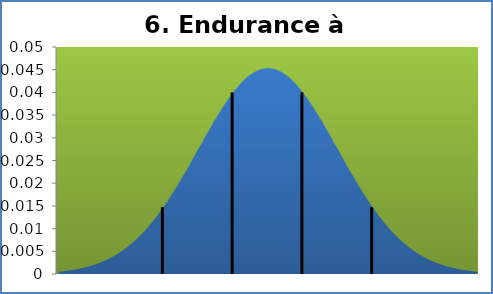
| Category | densité |
|---|---|
| 19.770000000000003 | 0.001 |
| 20.21 | 0.001 |
| 20.65 | 0.001 |
| 21.09 | 0.001 |
| 21.529999999999998 | 0.001 |
| 21.97 | 0.001 |
| 22.41 | 0.001 |
| 22.85 | 0.001 |
| 23.29 | 0.002 |
| 23.73 | 0.002 |
| 24.169999999999998 | 0.002 |
| 24.61 | 0.002 |
| 25.05 | 0.003 |
| 25.490000000000002 | 0.003 |
| 25.93 | 0.003 |
| 26.369999999999997 | 0.004 |
| 26.81 | 0.004 |
| 27.25 | 0.004 |
| 27.69 | 0.005 |
| 28.130000000000003 | 0.006 |
| 28.57 | 0.006 |
| 29.009999999999998 | 0.007 |
| 29.45 | 0.007 |
| 29.89 | 0.008 |
| 30.330000000000002 | 0.009 |
| 30.770000000000003 | 0.01 |
| 31.21 | 0.011 |
| 31.65 | 0.012 |
| 32.09 | 0.013 |
| 32.53 | 0.014 |
| 32.97 | 0.015 |
| 33.41 | 0.016 |
| 33.85 | 0.017 |
| 34.29 | 0.018 |
| 34.730000000000004 | 0.019 |
| 35.17 | 0.021 |
| 35.61 | 0.022 |
| 36.05 | 0.023 |
| 36.49 | 0.025 |
| 36.93 | 0.026 |
| 37.370000000000005 | 0.027 |
| 37.81 | 0.029 |
| 38.25 | 0.03 |
| 38.69 | 0.032 |
| 39.13 | 0.033 |
| 39.57 | 0.034 |
| 40.01 | 0.035 |
| 40.45 | 0.037 |
| 40.89 | 0.038 |
| 41.33 | 0.039 |
| 41.77 | 0.04 |
| 42.21 | 0.041 |
| 42.65 | 0.042 |
| 43.09 | 0.043 |
| 43.53 | 0.043 |
| 43.97 | 0.044 |
| 44.410000000000004 | 0.044 |
| 44.85 | 0.045 |
| 45.29 | 0.045 |
| 45.730000000000004 | 0.045 |
| 46.17 | 0.045 |
| 46.61 | 0.045 |
| 47.050000000000004 | 0.045 |
| 47.49 | 0.045 |
| 47.93 | 0.044 |
| 48.370000000000005 | 0.044 |
| 48.81 | 0.043 |
| 49.25 | 0.043 |
| 49.690000000000005 | 0.042 |
| 50.13 | 0.041 |
| 50.57 | 0.04 |
| 51.010000000000005 | 0.039 |
| 51.45 | 0.038 |
| 51.89 | 0.037 |
| 52.330000000000005 | 0.035 |
| 52.77 | 0.034 |
| 53.21 | 0.033 |
| 53.650000000000006 | 0.032 |
| 54.09 | 0.03 |
| 54.53 | 0.029 |
| 54.97 | 0.027 |
| 55.410000000000004 | 0.026 |
| 55.85 | 0.025 |
| 56.290000000000006 | 0.023 |
| 56.730000000000004 | 0.022 |
| 57.17 | 0.021 |
| 57.61 | 0.019 |
| 58.050000000000004 | 0.018 |
| 58.49 | 0.017 |
| 58.93000000000001 | 0.016 |
| 59.370000000000005 | 0.015 |
| 59.81 | 0.014 |
| 60.25 | 0.013 |
| 60.690000000000005 | 0.012 |
| 61.13 | 0.011 |
| 61.57 | 0.01 |
| 62.010000000000005 | 0.009 |
| 62.45 | 0.008 |
| 62.89 | 0.007 |
| 63.330000000000005 | 0.007 |
| 63.77 | 0.006 |
| 64.21000000000001 | 0.006 |
| 64.65 | 0.005 |
| 65.09 | 0.004 |
| 65.53 | 0.004 |
| 65.97 | 0.004 |
| 66.41 | 0.003 |
| 66.85 | 0.003 |
| 67.29 | 0.003 |
| 67.73 | 0.002 |
| 68.17 | 0.002 |
| 68.61 | 0.002 |
| 69.05000000000001 | 0.002 |
| 69.49000000000001 | 0.001 |
| 69.93 | 0.001 |
| 70.37 | 0.001 |
| 70.81 | 0.001 |
| 71.25 | 0.001 |
| 71.69 | 0.001 |
| 72.13 | 0.001 |
| 72.57 | 0.001 |